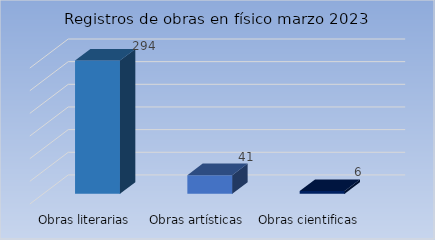
| Category | Series 0 |
|---|---|
| Obras literarias | 294 |
| Obras artísticas | 41 |
| Obras cientificas | 6 |